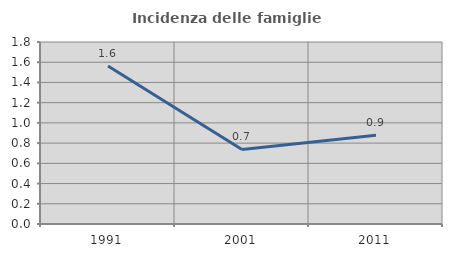
| Category | Incidenza delle famiglie numerose |
|---|---|
| 1991.0 | 1.564 |
| 2001.0 | 0.737 |
| 2011.0 | 0.878 |